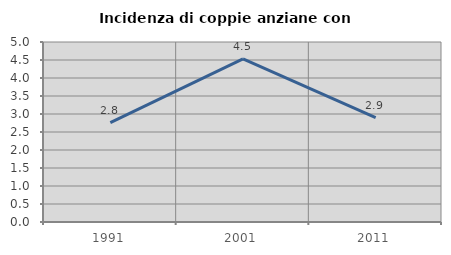
| Category | Incidenza di coppie anziane con figli |
|---|---|
| 1991.0 | 2.76 |
| 2001.0 | 4.53 |
| 2011.0 | 2.899 |